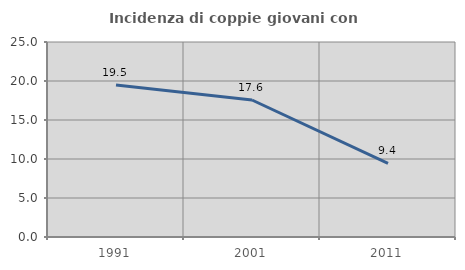
| Category | Incidenza di coppie giovani con figli |
|---|---|
| 1991.0 | 19.477 |
| 2001.0 | 17.565 |
| 2011.0 | 9.447 |